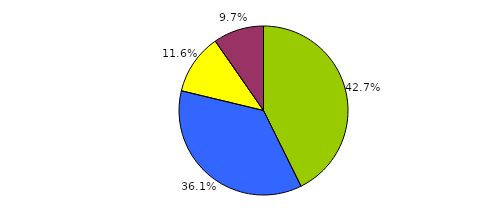
| Category | Series 0 |
|---|---|
| 0 | 472 |
| 1 | 399 |
| 2 | 128 |
| 3 | 107 |